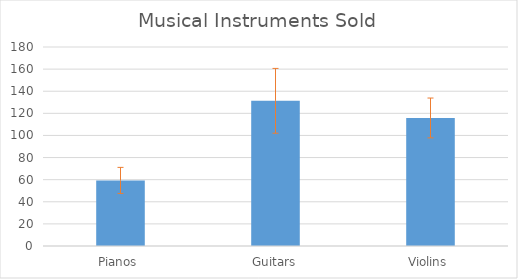
| Category | Mean |
|---|---|
| Pianos | 59.333 |
| Guitars | 131.333 |
| Violins | 115.833 |